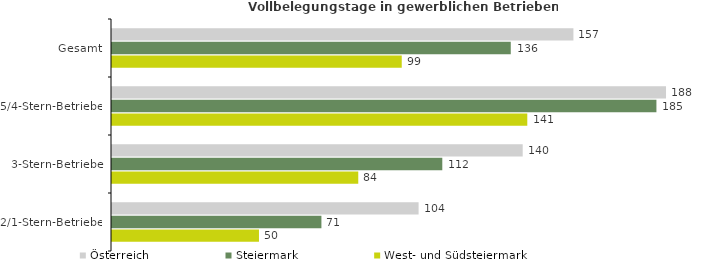
| Category | Österreich | Steiermark | West- und Südsteiermark |
|---|---|---|---|
| Gesamt | 156.946 | 135.634 | 98.551 |
| 5/4-Stern-Betriebe | 188.443 | 185.178 | 141.255 |
| 3-Stern-Betriebe | 139.696 | 112.345 | 83.761 |
| 2/1-Stern-Betriebe | 104.286 | 71.229 | 49.99 |